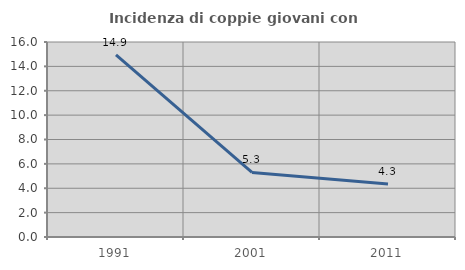
| Category | Incidenza di coppie giovani con figli |
|---|---|
| 1991.0 | 14.943 |
| 2001.0 | 5.298 |
| 2011.0 | 4.348 |